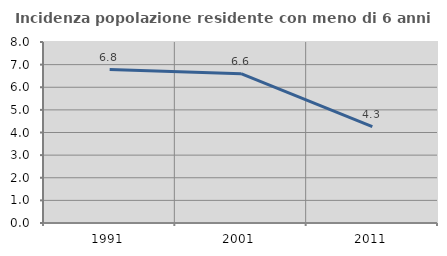
| Category | Incidenza popolazione residente con meno di 6 anni |
|---|---|
| 1991.0 | 6.781 |
| 2001.0 | 6.6 |
| 2011.0 | 4.26 |